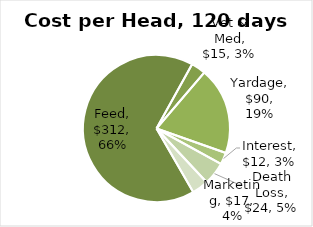
| Category | Cost per Head, 120 days |
|---|---|
| Feed | 312 |
| Vet & Med | 15 |
| Yardage | 90 |
| Interest | 12.268 |
| Death Loss | 23.716 |
| Marketing | 17 |